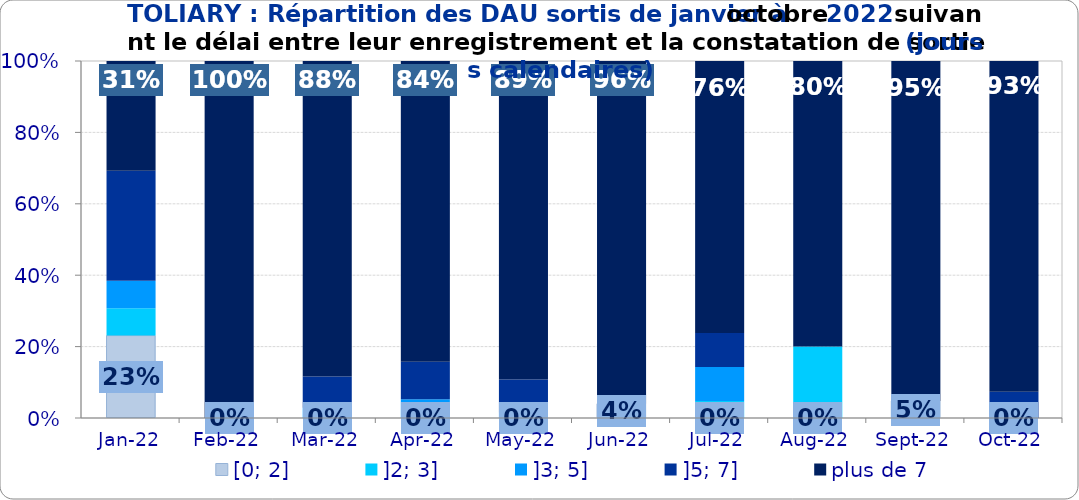
| Category | [0; 2] | ]2; 3] | ]3; 5] | ]5; 7] | plus de 7 |
|---|---|---|---|---|---|
| 2022-01-01 | 0.231 | 0.077 | 0.077 | 0.308 | 0.308 |
| 2022-02-01 | 0 | 0 | 0 | 0 | 1 |
| 2022-03-01 | 0 | 0 | 0.029 | 0.087 | 0.884 |
| 2022-04-01 | 0 | 0 | 0.053 | 0.105 | 0.842 |
| 2022-05-01 | 0 | 0 | 0.015 | 0.092 | 0.892 |
| 2022-06-01 | 0.04 | 0 | 0 | 0 | 0.96 |
| 2022-07-01 | 0 | 0.048 | 0.095 | 0.095 | 0.762 |
| 2022-08-01 | 0 | 0.2 | 0 | 0 | 0.8 |
| 2022-09-01 | 0.048 | 0 | 0 | 0 | 0.952 |
| 2022-10-01 | 0 | 0 | 0 | 0.074 | 0.926 |